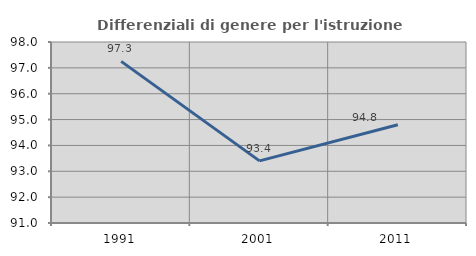
| Category | Differenziali di genere per l'istruzione superiore |
|---|---|
| 1991.0 | 97.25 |
| 2001.0 | 93.402 |
| 2011.0 | 94.798 |